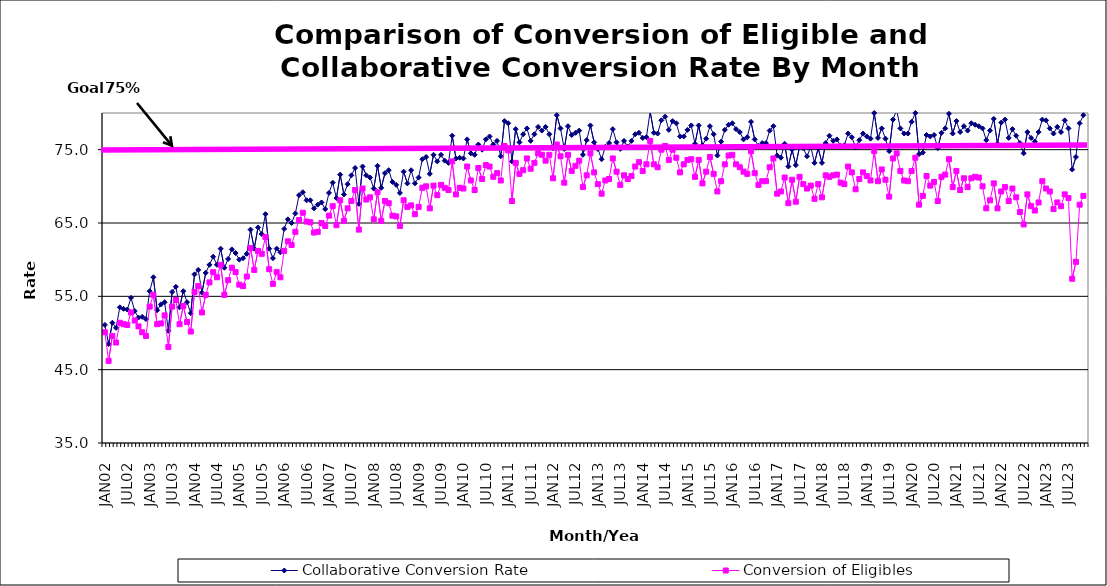
| Category | Collaborative Conversion Rate | Conversion of Eligibles |
|---|---|---|
| JAN02 | 51.1 | 50.1 |
| FEB02 | 48.5 | 46.2 |
| MAR02 | 51.4 | 49.6 |
| APR02 | 50.7 | 48.7 |
| MAY02 | 53.5 | 51.4 |
| JUN02 | 53.3 | 51.2 |
| JUL02 | 53.2 | 51.1 |
| AUG02 | 54.8 | 52.8 |
| SEP02 | 53 | 51.7 |
| OCT02 | 52.1 | 50.9 |
| NOV02 | 52.2 | 50.1 |
| DEC02 | 51.9 | 49.6 |
| JAN03 | 55.7 | 53.6 |
| FEB03 | 57.6 | 55.2 |
| MAR03 | 53.1 | 51.2 |
| APR03 | 53.9 | 51.3 |
| MAY03 | 54.2 | 52.4 |
| JUN03 | 50.3 | 48.1 |
| JUL03 | 55.6 | 53.6 |
| AUG03 | 56.3 | 54.5 |
| SEP03 | 53.5 | 51.2 |
| OCT03 | 55.7 | 53.7 |
| NOV03 | 54.2 | 51.5 |
| DEC03 | 52.7 | 50.2 |
| JAN04 | 58 | 55.6 |
| FEB04 | 58.6 | 56.4 |
| MAR04 | 55.5 | 52.8 |
| APR04 | 58.2 | 55.2 |
| MAY04 | 59.3 | 56.9 |
| JUN04 | 60.4 | 58.3 |
| JUL04 | 59.3 | 57.6 |
| AUG04 | 61.5 | 59.3 |
| SEP04 | 58.9 | 55.2 |
| OCT04 | 60.1 | 57.2 |
| NOV04 | 61.4 | 58.9 |
| DEC04 | 60.9 | 58.3 |
| JAN05 | 60 | 56.6 |
| FEB05 | 60.2 | 56.4 |
| MAR05 | 60.8 | 57.7 |
| APR05 | 64.1 | 61.6 |
| MAY05 | 61.5 | 58.6 |
| JUN05 | 64.4 | 61.2 |
| JUL05 | 63.5 | 60.8 |
| AUG05 | 66.2 | 63.1 |
| SEP05 | 61.5 | 58.7 |
| OCT05 | 60.2 | 56.7 |
| NOV05 | 61.5 | 58.3 |
| DEC05 | 61 | 57.6 |
| JAN06 | 64.2 | 61.2 |
| FEB06 | 65.5 | 62.5 |
| MAR06 | 65 | 62 |
| APR06 | 66.3 | 63.8 |
| MAY06 | 68.8 | 65.4 |
| JUN06 | 69.2 | 66.4 |
| JUL06 | 68.1 | 65.2 |
| AUG06 | 68.1 | 65.1 |
| SEP06 | 67 | 63.7 |
| OCT06 | 67.5 | 63.8 |
| NOV06 | 67.8 | 65 |
| DEC06 | 66.9 | 64.6 |
| JAN07 | 69.1 | 66 |
| FEB07 | 70.5 | 67.3 |
| MAR07 | 68.4 | 64.7 |
| APR07 | 71.6 | 68.1 |
| MAY07 | 68.9 | 65.3 |
| JUN07 | 70.3 | 67 |
| JUL07 | 71.5 | 68 |
| AUG07 | 72.5 | 69.5 |
| SEP07 | 67.6 | 64.1 |
| OCT07 | 72.7 | 69.7 |
| NOV07 | 71.5 | 68.2 |
| DEC07 | 71.2 | 68.5 |
| JAN08 | 69.7 | 65.5 |
| FEB08 | 72.8 | 69.2 |
| MAR08 | 69.8 | 65.3 |
| APR08 | 71.8 | 68 |
| MAY08 | 72.2 | 67.7 |
| JUN08 | 70.6 | 66 |
| JUL08 | 70.2 | 65.9 |
| AUG08 | 69.1 | 64.6 |
| SEP08 | 72 | 68.1 |
| OCT08 | 70.4 | 67.2 |
| NOV08 | 72.2 | 67.4 |
| DEC08 | 70.4 | 66.2 |
| JAN09 | 71.2 | 67.2 |
| FEB09 | 73.7 | 69.8 |
| MAR09 | 74 | 70 |
| APR09 | 71.7 | 67 |
| MAY09 | 74.3 | 70.1 |
| JUN09 | 73.4 | 68.8 |
| JUL09 | 74.3 | 70.2 |
| AUG09 | 73.5 | 69.8 |
| SEP09 | 73.2 | 69.5 |
| OCT09 | 76.9 | 73.4 |
| NOV09 | 73.8 | 68.9 |
| DEC09 | 73.9 | 69.8 |
| JAN10 | 73.8 | 69.7 |
| FEB10 | 76.4 | 72.7 |
| MAR10 | 74.5 | 70.8 |
| APR10 | 74.3 | 69.5 |
| MAY10 | 75.7 | 72.5 |
| JUN10 | 75 | 71 |
| JUL10 | 76.4 | 72.9 |
| AUG10 | 76.8 | 72.7 |
| SEP10 | 75.7 | 71.3 |
| OCT10 | 76.2 | 71.8 |
| NOV10 | 74.1 | 70.8 |
| DEC10 | 78.9 | 75.5 |
| JAN11 | 78.6 | 74.9 |
| FEB11 | 73.4 | 68 |
| MAR11 | 77.8 | 73.2 |
| APR11 | 76 | 71.7 |
| MAY11 | 77.1 | 72.2 |
| JUN11 | 77.9 | 73.8 |
| JUL11 | 76.2 | 72.4 |
| AUG11 | 77.1 | 73.2 |
| SEP11 | 78.1 | 74.5 |
| OCT11 | 77.6 | 74.3 |
| NOV11 | 78.1 | 73.5 |
| DEC11 | 77.1 | 74.3 |
| JAN12 | 75.2 | 71.1 |
| FEB12 | 79.7 | 75.7 |
| MAR12 | 77.9 | 74.1 |
| APR12 | 75.1 | 70.5 |
| MAY12 | 78.2 | 74.3 |
| JUN12 | 77 | 72.1 |
| JUL12 | 77.3 | 72.8 |
| AUG12 | 77.6 | 73.5 |
| SEP12 | 74.3 | 69.9 |
| OCT12 | 76.3 | 71.5 |
| NOV12 | 78.3 | 74.5 |
| DEC12 | 76 | 71.9 |
| JAN13 | 75.1 | 70.3 |
| FEB13 | 73.7 | 69 |
| MAR13 | 75.4 | 70.8 |
| APR13 | 75.9 | 71 |
| MAY13 | 77.8 | 73.8 |
| JUN13 | 76 | 72 |
| JUL13 | 75.1 | 70.2 |
| AUG13 | 76.2 | 71.5 |
| SEP13 | 75.4 | 71 |
| OCT13 | 76.2 | 71.4 |
| NOV13 | 77.1 | 72.7 |
| DEC13 | 77.3 | 73.3 |
| JAN14 | 76.6 | 72.1 |
| FEB14 | 76.7 | 73 |
| MAR14 | 80.2 | 76.2 |
| APR14 | 77.3 | 73 |
| MAY14 | 77.2 | 72.6 |
| JUN14 | 79 | 75 |
| JUL14 | 79.5 | 75.5 |
| AUG14 | 77.7 | 73.6 |
| SEP14 | 78.9 | 75 |
| OCT14 | 78.6 | 73.9 |
| NOV14 | 76.8 | 71.9 |
| DEC14 | 76.8 | 73 |
| JAN15 | 77.7 | 73.6 |
| FEB15 | 78.3 | 73.7 |
| MAR15 | 75.8 | 71.3 |
| APR15 | 78.3 | 73.6 |
| MAY15 | 75.6 | 70.4 |
| JUN15 | 76.5 | 72 |
| JUL15 | 78.2 | 74 |
| AUG15 | 77.1 | 71.7 |
| SEP15 | 74.2 | 69.3 |
| OCT15 | 76.1 | 70.7 |
| NOV15 | 77.7 | 73 |
| DEC15 | 78.4 | 74.2 |
| JAN16 | 78.6 | 74.3 |
| FEB16 | 77.8 | 73 |
| MAR16 | 77.4 | 72.6 |
| APR16 | 76.4 | 72 |
| MAY16 | 76.7 | 71.7 |
| JUN16 | 78.8 | 74.8 |
| JUL16 | 76.4 | 71.8 |
| AUG16 | 75.5 | 70.2 |
| SEP16 | 75.9 | 70.7 |
| OCT16 | 75.9 | 70.7 |
| NOV16 | 77.6 | 72.6 |
| DEC16 | 78.2 | 73.8 |
| JAN17 | 74.2 | 69 |
| FEB17 | 73.9 | 69.3 |
| MAR17 | 75.8 | 71.2 |
| APR17 | 72.7 | 67.7 |
| MAY17 | 75 | 70.9 |
| JUN17 | 72.9 | 67.9 |
| JUL17 | 75.4 | 71.3 |
| AUG17 | 75.2 | 70.3 |
| SEP17 | 74.1 | 69.7 |
| OCT17 | 75.4 | 70.1 |
| NOV17 | 73.2 | 68.3 |
| DEC17 | 75.2 | 70.3 |
| JAN18 | 73.2 | 68.5 |
| FEB18 | 75.9 | 71.5 |
| MAR18 | 76.9 | 71.3 |
| APR18 | 76.2 | 71.5 |
| MAY18 | 76.4 | 71.6 |
| JUN18 | 75.5 | 70.5 |
| JUL18 | 75.6 | 70.3 |
| AUG18 | 77.2 | 72.7 |
| SEP18 | 76.7 | 71.9 |
| OCT18 | 75.3 | 69.6 |
| NOV18 | 76.3 | 71 |
| DEC18 | 77.2 | 71.9 |
| JAN19 | 76.8 | 71.4 |
| FEB19 | 76.5 | 70.8 |
| MAR19 | 80 | 74.8 |
| APR19 | 76.6 | 70.7 |
| MAY19 | 77.9 | 72.3 |
| JUN19 | 76.5 | 70.9 |
| JUL19 | 74.8 | 68.6 |
| AUG19 | 79.1 | 73.8 |
| SEP19 | 80.4 | 74.5 |
| OCT19 | 77.9 | 72.1 |
| NOV19 | 77.2 | 70.8 |
| DEC19 | 77.2 | 70.7 |
| JAN20 | 78.8 | 72.1 |
| FEB20 | 80 | 73.9 |
| MAR20 | 74.4 | 67.5 |
| APR20 | 74.6 | 68.7 |
| MAY20 | 77 | 71.4 |
| JUN20 | 76.8 | 70.1 |
| JUL20 | 77 | 70.6 |
| AUG20 | 75.2 | 68 |
| SEP20 | 77.3 | 71.3 |
| OCT20 | 77.9 | 71.6 |
| NOV20 | 79.9 | 73.7 |
| DEC20 | 77.2 | 69.9 |
| JAN21 | 78.9 | 72.1 |
| FEB21 | 77.4 | 69.5 |
| MAR21 | 78.2 | 71.1 |
| APR21 | 77.6 | 69.9 |
| MAY21 | 78.6 | 71.1 |
| JUN21 | 78.4 | 71.3 |
| JUL21 | 78.2 | 71.2 |
| AUG21 | 77.9 | 70 |
| SEP21 | 76.3 | 67 |
| OCT21 | 77.6 | 68.1 |
| NOV21 | 79.2 | 70.4 |
| DEC21 | 75.8 | 67 |
| JAN22 | 78.7 | 69.3 |
| FEB22 | 79.1 | 69.9 |
| MAR22 | 76.6 | 68 |
| APR22 | 77.8 | 69.7 |
| MAY22 | 76.9 | 68.5 |
| JUN22 | 75.9 | 66.5 |
| JUL22 | 74.5 | 64.8 |
| AUG22 | 77.4 | 68.9 |
| SEP22 | 76.6 | 67.3 |
| OCT22 | 76.1 | 66.7 |
| NOV22 | 77.4 | 67.8 |
| DEC22 | 79.1 | 70.7 |
| JAN23 | 79 | 69.7 |
| FEB23 | 77.9 | 69.3 |
| MAR23 | 77.2 | 66.9 |
| APR23 | 78.1 | 67.8 |
| MAY23 | 77.4 | 67.3 |
| JUN23 | 79 | 68.9 |
| JUL23 | 77.9 | 68.4 |
| AUG23 | 72.3 | 57.4 |
| SEP23 | 74 | 59.7 |
| OCT23 | 78.6 | 67.5 |
| NOV23 | 79.7 | 68.7 |